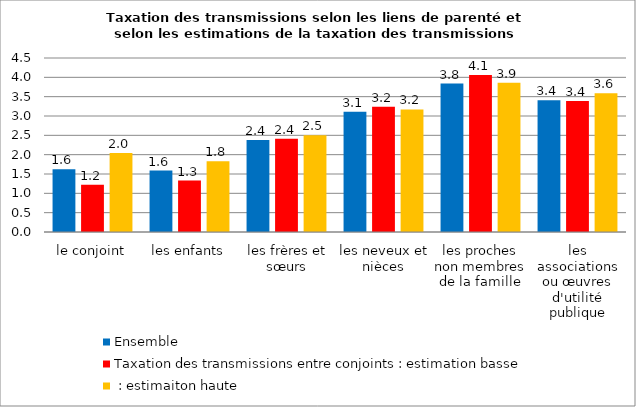
| Category | Ensemble | Taxation des transmissions entre conjoints : estimation basse | Taxation des transmissions entre conjoints : estimaiton haute |
|---|---|---|---|
| le conjoint | 1.62 | 1.22 | 2.04 |
| les enfants | 1.59 | 1.33 | 1.83 |
| les frères et sœurs | 2.38 | 2.41 | 2.5 |
| les neveux et nièces | 3.11 | 3.24 | 3.17 |
| les proches non membres de la famille | 3.84 | 4.06 | 3.86 |
| les associations ou œuvres d'utilité publique | 3.41 | 3.39 | 3.59 |